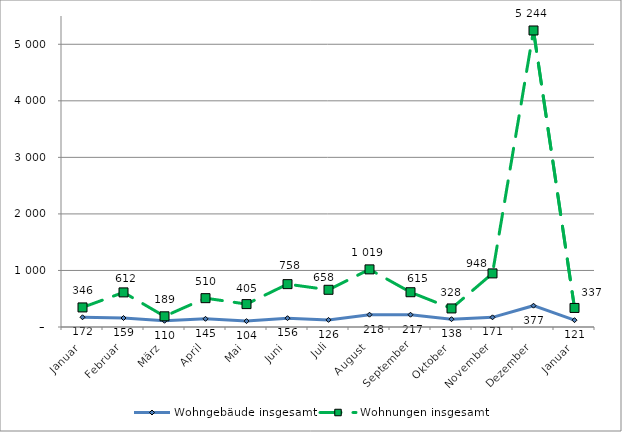
| Category | Wohngebäude insgesamt | Wohnungen insgesamt |
|---|---|---|
| Januar | 172 | 346 |
| Februar | 159 | 612 |
| März | 110 | 189 |
| April | 145 | 510 |
| Mai | 104 | 405 |
| Juni | 156 | 758 |
| Juli | 126 | 658 |
| August | 218 | 1019 |
| September | 217 | 615 |
| Oktober | 138 | 328 |
| November | 171 | 948 |
| Dezember | 377 | 5244 |
| Januar | 121 | 337 |